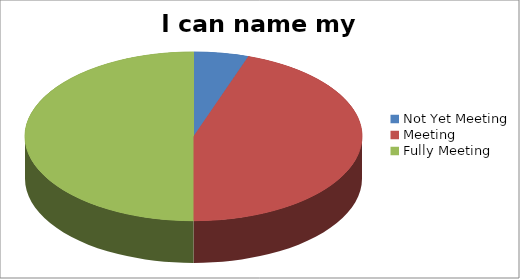
| Category | I can name my feelings |
|---|---|
| Not Yet Meeting | 2 |
| Meeting | 17 |
| Fully Meeting | 19 |